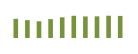
| Category | Saldo [ (1)-(2) ] |
|---|---|
| 2007.0 | 532729.955 |
| 2008.0 | 495602.949 |
| 2009.0 | 464912.543 |
| 2010.0 | 524886.84 |
| 2011.0 | 575003.691 |